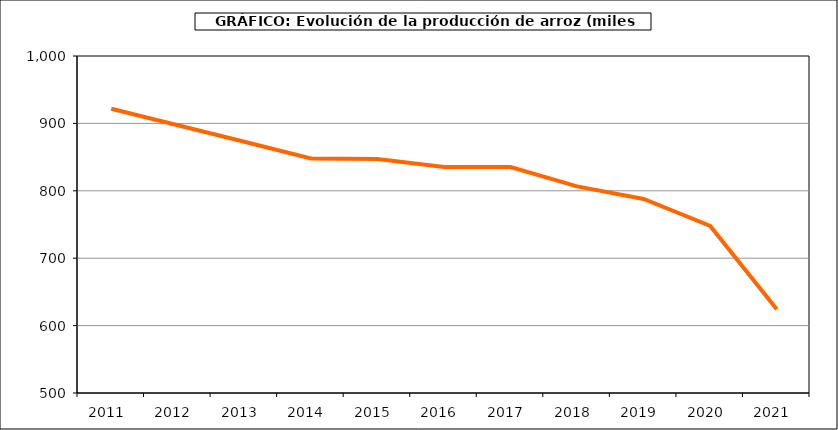
| Category | Superficie |
|---|---|
| 2011.0 | 921.738 |
| 2012.0 | 897.318 |
| 2013.0 | 872.689 |
| 2014.0 | 847.976 |
| 2015.0 | 847.026 |
| 2016.0 | 835.2 |
| 2017.0 | 835.178 |
| 2018.0 | 806.589 |
| 2019.0 | 787.832 |
| 2020.0 | 747.828 |
| 2021.0 | 624.352 |